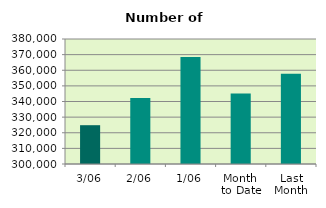
| Category | Series 0 |
|---|---|
| 3/06 | 324834 |
| 2/06 | 342194 |
| 1/06 | 368512 |
| Month 
to Date | 345180 |
| Last
Month | 357760.286 |